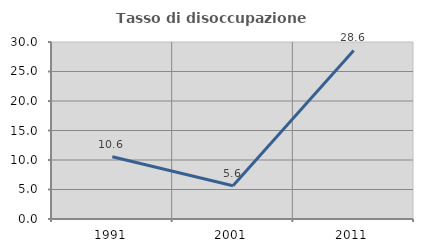
| Category | Tasso di disoccupazione giovanile  |
|---|---|
| 1991.0 | 10.563 |
| 2001.0 | 5.634 |
| 2011.0 | 28.571 |